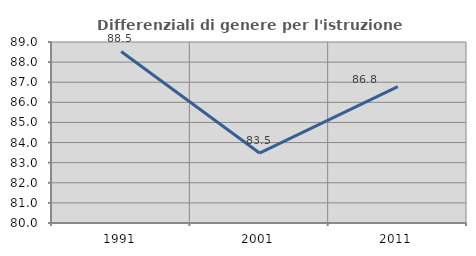
| Category | Differenziali di genere per l'istruzione superiore |
|---|---|
| 1991.0 | 88.528 |
| 2001.0 | 83.479 |
| 2011.0 | 86.784 |